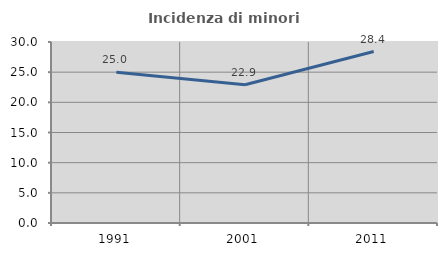
| Category | Incidenza di minori stranieri |
|---|---|
| 1991.0 | 25 |
| 2001.0 | 22.917 |
| 2011.0 | 28.421 |